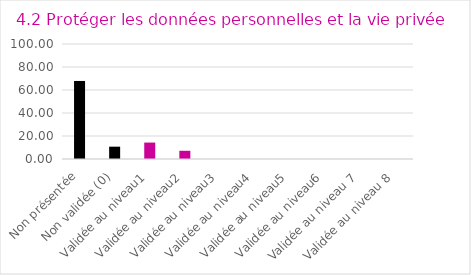
| Category | Series 0 |
|---|---|
| Non présentée | 67.857 |
| Non validée (0) | 10.714 |
| Validée au niveau1 | 14.286 |
| Validée au niveau2 | 7.143 |
| Validée au niveau3 | 0 |
| Validée au niveau4 | 0 |
| Validée au niveau5 | 0 |
| Validée au niveau6 | 0 |
| Validée au niveau 7 | 0 |
| Validée au niveau 8 | 0 |